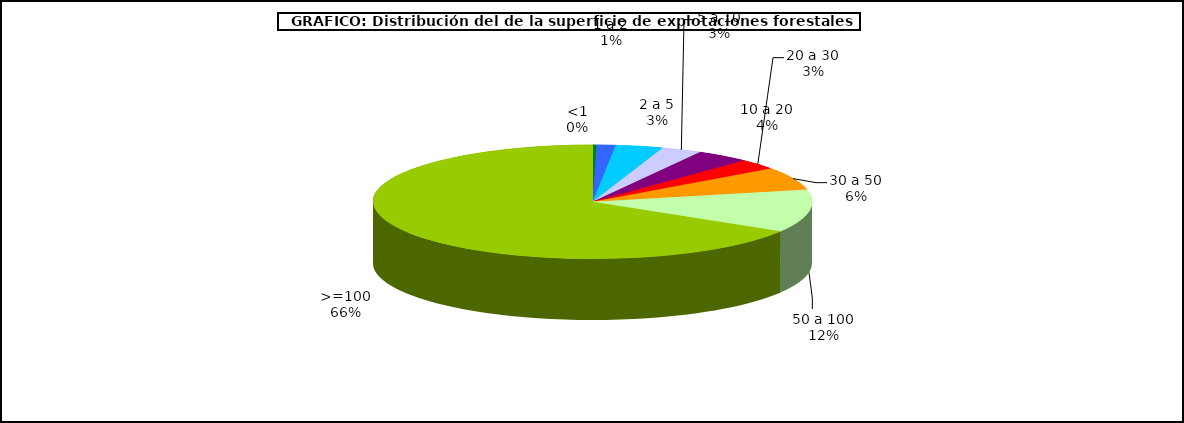
| Category | Series 0 |
|---|---|
| 0 | 13301 |
| 1 | 67826 |
| 2 | 167066 |
| 3 | 141856 |
| 4 | 190509 |
| 5 | 144545 |
| 6 | 312198 |
| 7 | 583744 |
| 8 | 3190906 |